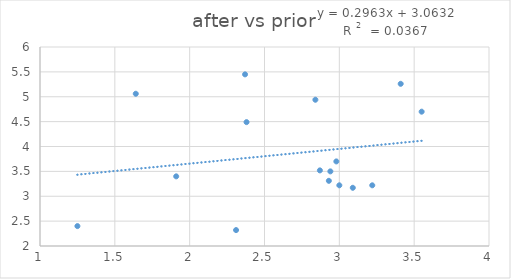
| Category | y |
|---|---|
| 1.25 | 2.4 |
| 2.94 | 3.5 |
| 2.38 | 4.49 |
| 3.09 | 3.17 |
| 3.41 | 5.26 |
| 3.0 | 3.22 |
| 2.31 | 2.32 |
| 2.93 | 3.31 |
| 2.98 | 3.7 |
| 3.55 | 4.7 |
| 2.84 | 4.94 |
| 1.64 | 5.06 |
| 3.22 | 3.22 |
| 2.87 | 3.52 |
| 2.37 | 5.45 |
| 1.91 | 3.4 |